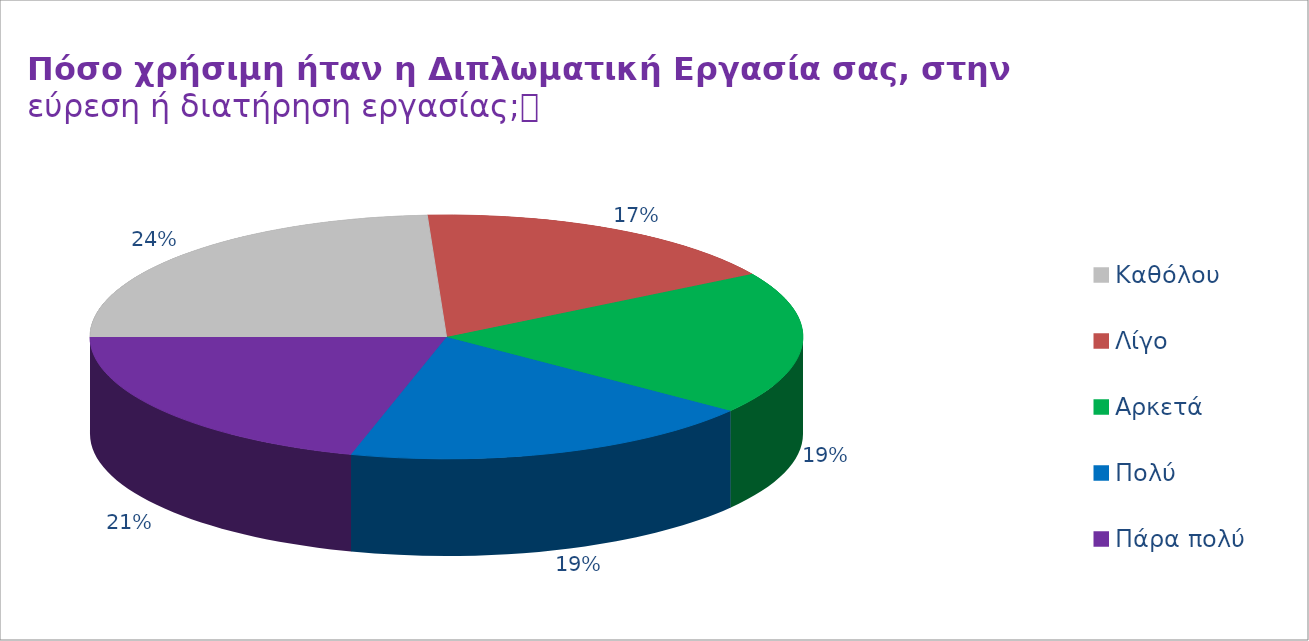
| Category | Series 2 | Series 1 | Series 0 |
|---|---|---|---|
| Καθόλου | 14 | 6 | 2 |
| Λίγο | 10 | 13 | 7 |
| Αρκετά | 11 | 12 | 30 |
| Πολύ | 11 | 14 | 9 |
| Πάρα πολύ | 12 | 13 | 10 |